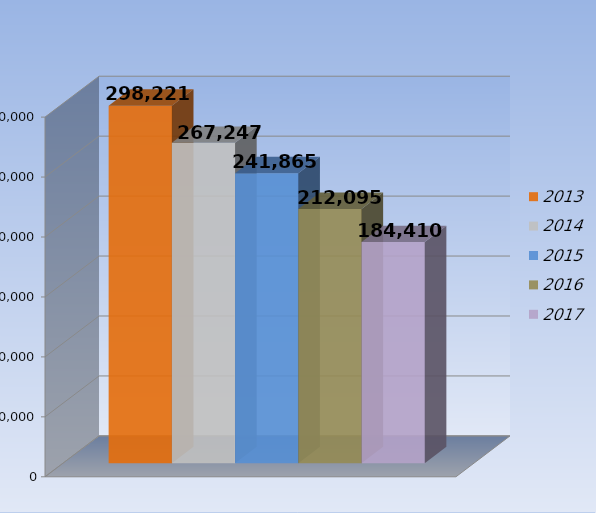
| Category | 2013 | 2014 | 2015 | 2016 | 2017 |
|---|---|---|---|---|---|
| 0 | 298221 | 267247 | 241865 | 212095 | 184410 |